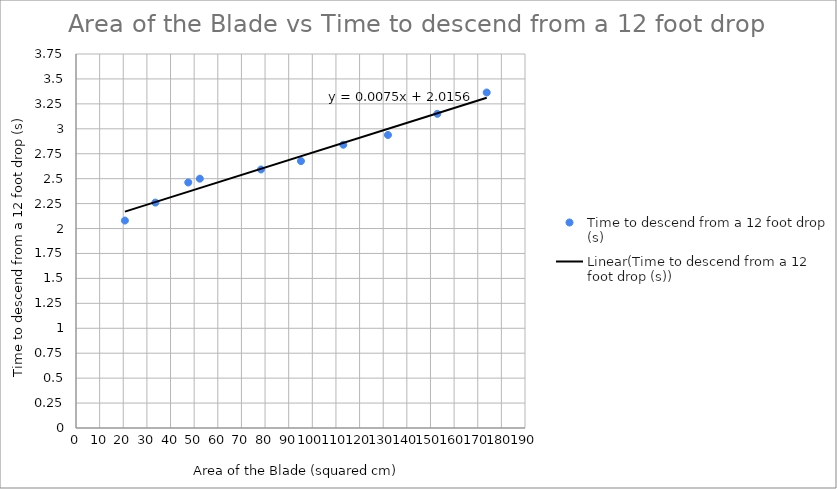
| Category | Time to descend from a 12 foot drop (s) |
|---|---|
| 173.8 | 3.364 |
| 152.9 | 3.15 |
| 132.0 | 2.938 |
| 113.1 | 2.84 |
| 95.2 | 2.676 |
| 78.3 | 2.592 |
| 52.4 | 2.5 |
| 47.5 | 2.462 |
| 33.6 | 2.26 |
| 20.7 | 2.08 |